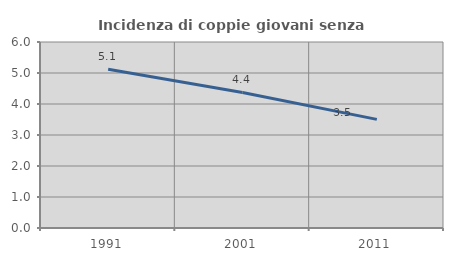
| Category | Incidenza di coppie giovani senza figli |
|---|---|
| 1991.0 | 5.12 |
| 2001.0 | 4.373 |
| 2011.0 | 3.504 |